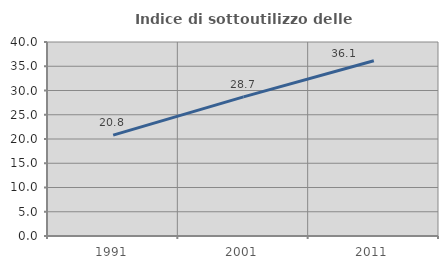
| Category | Indice di sottoutilizzo delle abitazioni  |
|---|---|
| 1991.0 | 20.797 |
| 2001.0 | 28.676 |
| 2011.0 | 36.143 |